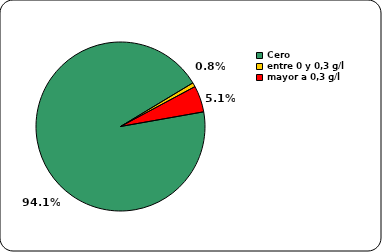
| Category | Herido leve |
|---|---|
| Cero | 0.941 |
| entre 0 y 0,3 g/l | 0.008 |
| mayor a 0,3 g/l | 0.05 |